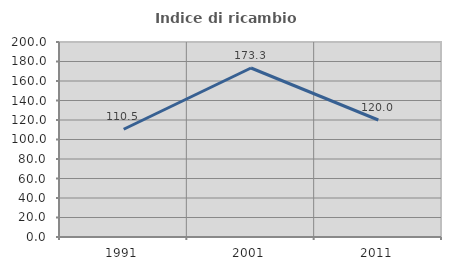
| Category | Indice di ricambio occupazionale  |
|---|---|
| 1991.0 | 110.526 |
| 2001.0 | 173.333 |
| 2011.0 | 120 |